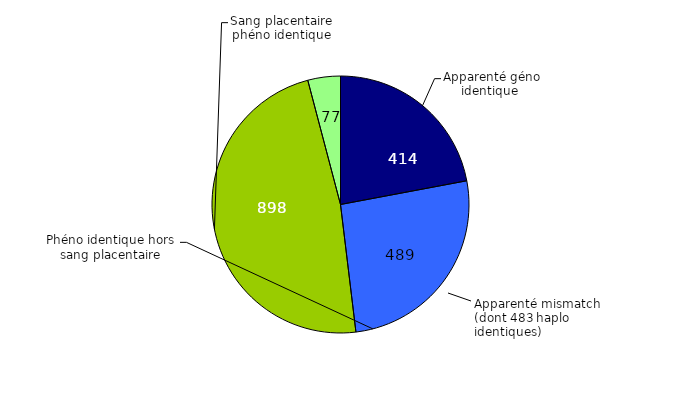
| Category | Nombre | Pourcentage |
|---|---|---|
| Apparenté géno identique | 414 | 0.22 |
| Apparenté mismatch | 489 | 0.26 |
| Phéno identique hors sang placentaire | 898 | 0.478 |
| Sang placentaire phéno identique | 77 | 0.041 |